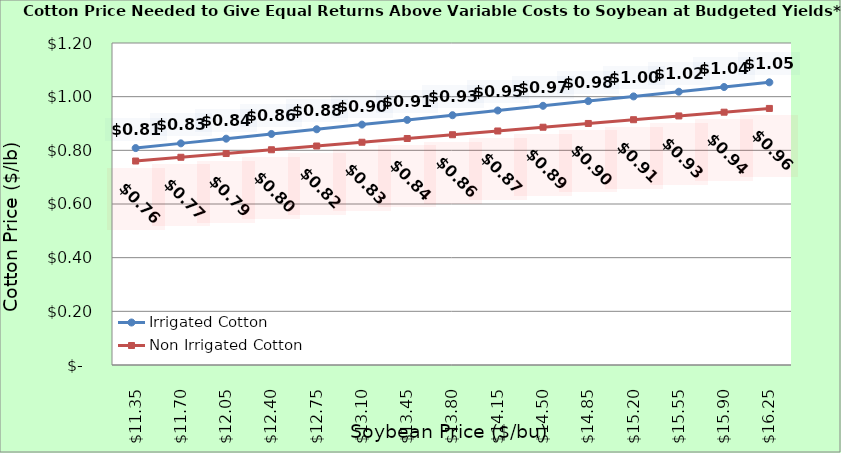
| Category | Irrigated Cotton | Non Irrigated Cotton |
|---|---|---|
| 11.350000000000003 | 0.808 | 0.76 |
| 11.700000000000003 | 0.826 | 0.774 |
| 12.050000000000002 | 0.843 | 0.788 |
| 12.400000000000002 | 0.861 | 0.802 |
| 12.750000000000002 | 0.878 | 0.816 |
| 13.100000000000001 | 0.896 | 0.83 |
| 13.450000000000001 | 0.913 | 0.844 |
| 13.8 | 0.931 | 0.858 |
| 14.15 | 0.948 | 0.872 |
| 14.5 | 0.966 | 0.886 |
| 14.85 | 0.983 | 0.9 |
| 15.2 | 1.001 | 0.914 |
| 15.549999999999999 | 1.018 | 0.928 |
| 15.899999999999999 | 1.036 | 0.942 |
| 16.25 | 1.053 | 0.956 |